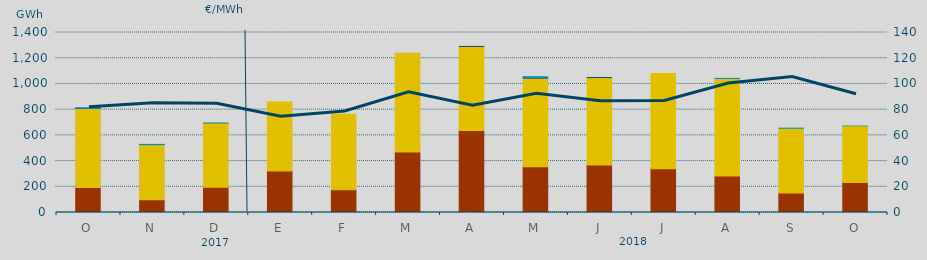
| Category | Carbón | Ciclo Combinado | Consumo Bombeo | Hidráulica | Otras Renovables |
|---|---|---|---|---|---|
| O | 195163.5 | 613794.4 | 2877.8 | 1865.1 | 0 |
| N | 99779.8 | 428275.6 | 370 | 1458.4 | 0 |
| D | 195559 | 499810.1 | 0 | 237.7 | 0 |
| E | 323414.2 | 535924.4 | 0 | 0 | 0 |
| F | 176086.6 | 587965.4 | 0 | 0 | 0 |
| M | 469679.3 | 766935.8 | 0 | 790 | 1096.8 |
| A | 637382 | 653437.2 | 1000 | 0 | 0 |
| M | 356322 | 688216.9 | 5321 | 6699 | 0 |
| J | 368722 | 680942.3 | 583.4 | 0 | 0 |
| J | 340015 | 740572.3 | 0 | 0 | 0 |
| A | 283796.9 | 758484.6 | 0 | 758.5 | 0 |
| S | 151862.8 | 503288.5 | 0 | 711.8 | 0 |
| O | 233100.2 | 436412.2 | 1448.2 | 441.9 | 60.2 |